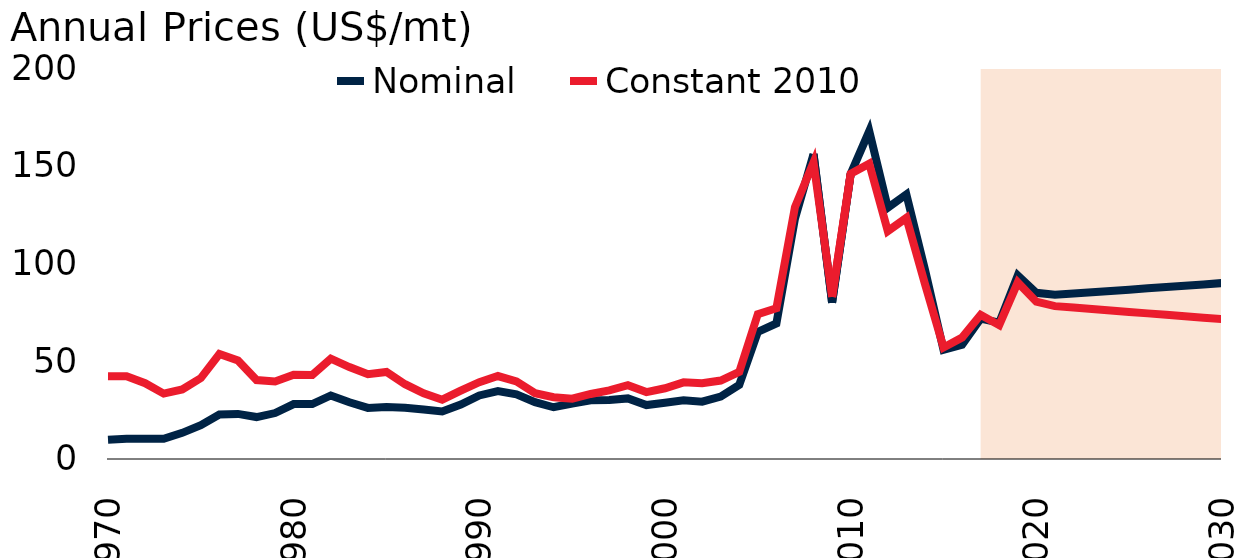
| Category | Nominal | Constant 2010 |
|---|---|---|
| 1970.0 | 9.84 | 42.387 |
| 1971.0 | 10.33 | 42.311 |
| 1972.0 | 10.33 | 38.787 |
| 1973.0 | 10.33 | 33.445 |
| 1974.0 | 13.38 | 35.547 |
| 1975.0 | 17.3 | 41.385 |
| 1976.0 | 22.72 | 53.691 |
| 1977.0 | 23.06 | 50.413 |
| 1978.0 | 21.45 | 40.352 |
| 1979.0 | 23.5 | 39.63 |
| 1980.0 | 28.09 | 43.067 |
| 1981.0 | 28.09 | 43.018 |
| 1982.0 | 32.5 | 51.299 |
| 1983.0 | 29 | 47.022 |
| 1984.0 | 26.15 | 43.355 |
| 1985.0 | 26.56 | 44.498 |
| 1986.0 | 26.26 | 38.252 |
| 1987.0 | 25.3 | 33.63 |
| 1988.0 | 24.3 | 30.332 |
| 1989.0 | 27.83 | 34.948 |
| 1990.0 | 32.5 | 39.312 |
| 1991.0 | 34.76 | 42.436 |
| 1992.0 | 33.1 | 39.668 |
| 1993.0 | 29.09 | 33.699 |
| 1994.0 | 26.47 | 31.614 |
| 1995.0 | 28.38 | 30.875 |
| 1996.0 | 30 | 33.271 |
| 1997.0 | 30.15 | 35.09 |
| 1998.0 | 31 | 37.726 |
| 1999.0 | 27.59 | 34.234 |
| 2000.0 | 28.79 | 36.187 |
| 2001.0 | 30.03 | 39.215 |
| 2002.0 | 29.31 | 38.727 |
| 2003.0 | 31.95 | 40.129 |
| 2004.0 | 37.9 | 44.575 |
| 2005.0 | 65 | 74.113 |
| 2006.0 | 69.333 | 77.1 |
| 2007.0 | 122.988 | 128.878 |
| 2008.0 | 155.993 | 151.694 |
| 2009.0 | 79.979 | 82.913 |
| 2010.0 | 145.863 | 145.863 |
| 2011.0 | 167.754 | 151.078 |
| 2012.0 | 128.496 | 116.573 |
| 2013.0 | 135.361 | 123.34 |
| 2014.0 | 96.952 | 89.566 |
| 2015.0 | 55.854 | 57.071 |
| 2016.0 | 58.424 | 62.132 |
| 2017.0 | 71.76 | 73.763 |
| 2018.0 | 69.752 | 68.479 |
| 2019.0 | 93.849 | 90.345 |
| 2020.0 | 85 | 80.458 |
| 2021.0 | 84 | 78.201 |
| 2022.0 | 84.646 | 77.441 |
| 2023.0 | 85.298 | 76.696 |
| 2024.0 | 85.954 | 75.959 |
| 2025.0 | 86.616 | 75.223 |
| 2026.0 | 87.282 | 74.489 |
| 2027.0 | 87.954 | 73.753 |
| 2028.0 | 88.631 | 73.017 |
| 2029.0 | 89.313 | 72.281 |
| 2030.0 | 90 | 71.544 |